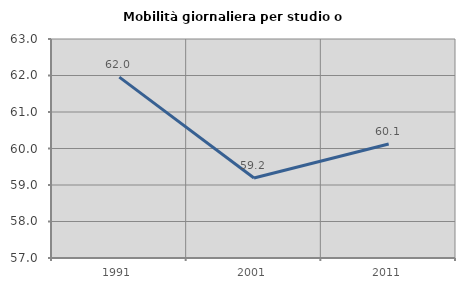
| Category | Mobilità giornaliera per studio o lavoro |
|---|---|
| 1991.0 | 61.955 |
| 2001.0 | 59.191 |
| 2011.0 | 60.122 |